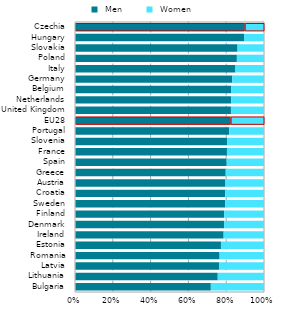
| Category |  Men |  Women |
|---|---|---|
| Bulgaria | 72.8 | 28.5 |
| Lithuania | 31.8 | 10.3 |
| Latvia | 21.8 | 6.8 |
| Romania | 151.4 | 46.5 |
| Estonia | 31.2 | 9.2 |
| Ireland | 88.8 | 24.1 |
| Denmark | 120 | 32.1 |
| Finland | 137.7 | 36.8 |
| Sweden | 286.3 | 73.9 |
| Croatia | 44.3 | 11.4 |
| Austria | 146.9 | 37.7 |
| Greece | 64.6 | 16.4 |
| Spain | 574.5 | 141.4 |
| France | 908.1 | 221.5 |
| Slovenia | 31.1 | 7.5 |
| Portugal | 143.3 | 32.2 |
| EU28 | 7722.2 | 1659.8 |
| United Kingdom | 1432.1 | 303.6 |
| Netherlands | 417.4 | 87.2 |
| Belgium | 198.1 | 41.3 |
| Germany | 1403.7 | 283.2 |
| Italy | 696.6 | 124.1 |
| Poland | 438.5 | 73.5 |
| Slovakia | 83 | 13.5 |
| Hungary | 136.3 | 16.1 |
| Czechia | 192.1 | 21.9 |